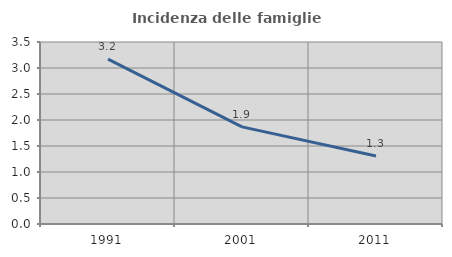
| Category | Incidenza delle famiglie numerose |
|---|---|
| 1991.0 | 3.169 |
| 2001.0 | 1.867 |
| 2011.0 | 1.307 |